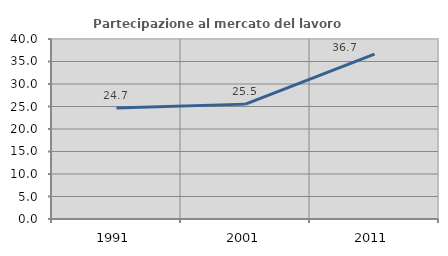
| Category | Partecipazione al mercato del lavoro  femminile |
|---|---|
| 1991.0 | 24.67 |
| 2001.0 | 25.528 |
| 2011.0 | 36.66 |